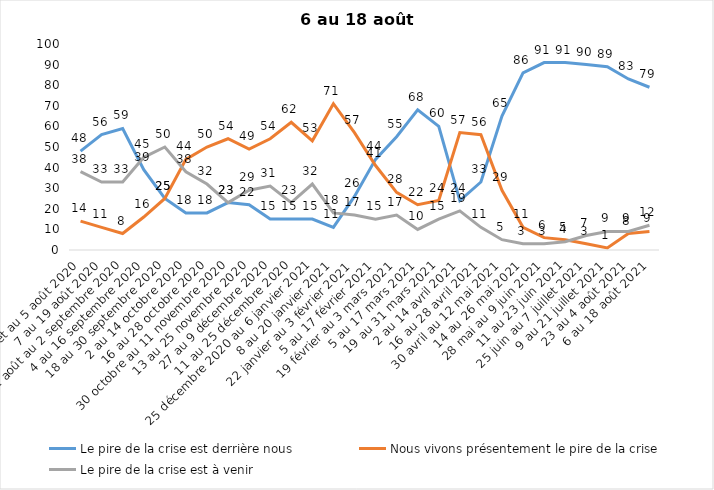
| Category | Le pire de la crise est derrière nous | Nous vivons présentement le pire de la crise | Le pire de la crise est à venir |
|---|---|---|---|
| 24 juillet au 5 août 2020 | 48 | 14 | 38 |
| 7 au 19 août 2020 | 56 | 11 | 33 |
| 21 août au 2 septembre 2020 | 59 | 8 | 33 |
| 4 au 16 septembre 2020 | 39 | 16 | 45 |
| 18 au 30 septembre 2020 | 25 | 25 | 50 |
| 2 au 14 octobre 2020 | 18 | 44 | 38 |
| 16 au 28 octobre 2020 | 18 | 50 | 32 |
| 30 octobre au 11 novembre 2020 | 23 | 54 | 23 |
| 13 au 25 novembre 2020 | 22 | 49 | 29 |
| 27 au 9 décembre 2020 | 15 | 54 | 31 |
| 11 au 25 décembre 2020 | 15 | 62 | 23 |
| 25 décembre 2020 au 6 janvier 2021 | 15 | 53 | 32 |
| 8 au 20 janvier 2021 | 11 | 71 | 18 |
| 22 janvier au 3 février 2021 | 26 | 57 | 17 |
| 5 au 17 février 2021 | 44 | 41 | 15 |
| 19 février au 3 mars 2021 | 55 | 28 | 17 |
| 5 au 17 mars 2021 | 68 | 22 | 10 |
| 19 au 31 mars 2021 | 60 | 24 | 15 |
| 2 au 14 avril 2021 | 24 | 57 | 19 |
| 16 au 28 avril 2021 | 33 | 56 | 11 |
| 30 avril au 12 mai 2021 | 65 | 29 | 5 |
| 14 au 26 mai 2021 | 86 | 11 | 3 |
| 28 mai au 9 juin 2021 | 91 | 6 | 3 |
| 11 au 23 juin 2021 | 91 | 5 | 4 |
| 25 juin au 7 juillet 2021 | 90 | 3 | 7 |
| 9 au 21 juillet 2021 | 89 | 1 | 9 |
| 23 au 4 août 2021 | 83 | 8 | 9 |
| 6 au 18 août 2021 | 79 | 9 | 12 |